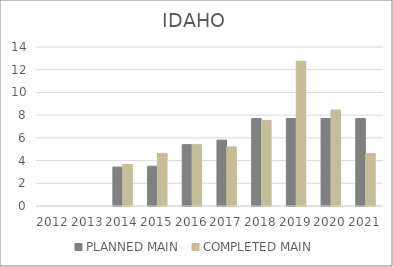
| Category | PLANNED MAIN  | COMPLETED MAIN |
|---|---|---|
| 2012.0 | 0 | 0 |
| 2013.0 | 0 | 0 |
| 2014.0 | 3.424 | 3.654 |
| 2015.0 | 3.5 | 4.63 |
| 2016.0 | 5.4 | 5.4 |
| 2017.0 | 5.8 | 5.2 |
| 2018.0 | 7.7 | 7.54 |
| 2019.0 | 7.7 | 12.74 |
| 2020.0 | 7.7 | 8.45 |
| 2021.0 | 7.7 | 4.61 |